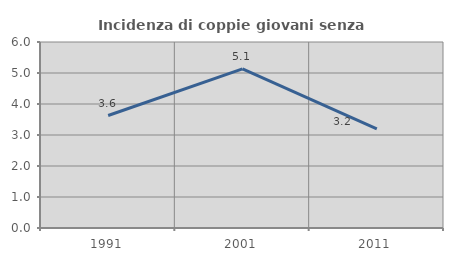
| Category | Incidenza di coppie giovani senza figli |
|---|---|
| 1991.0 | 3.629 |
| 2001.0 | 5.133 |
| 2011.0 | 3.197 |